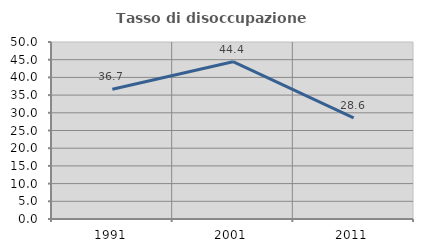
| Category | Tasso di disoccupazione giovanile  |
|---|---|
| 1991.0 | 36.667 |
| 2001.0 | 44.444 |
| 2011.0 | 28.571 |